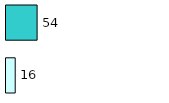
| Category | Series 0 | Series 1 |
|---|---|---|
| 0 | 16 | 54 |